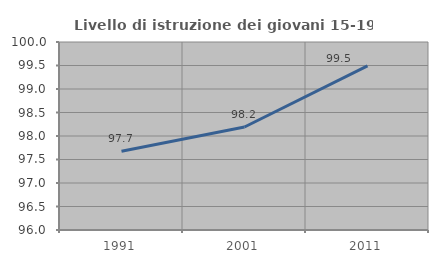
| Category | Livello di istruzione dei giovani 15-19 anni |
|---|---|
| 1991.0 | 97.674 |
| 2001.0 | 98.191 |
| 2011.0 | 99.492 |